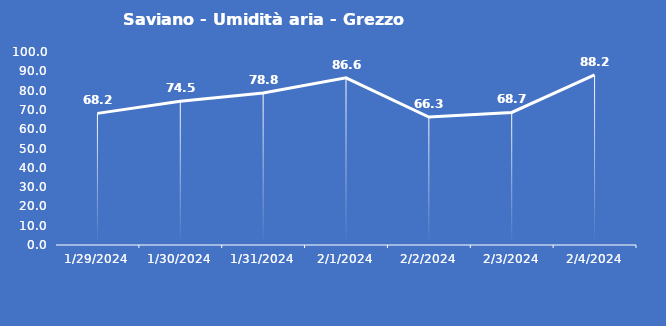
| Category | Saviano - Umidità aria - Grezzo (%) |
|---|---|
| 1/29/24 | 68.2 |
| 1/30/24 | 74.5 |
| 1/31/24 | 78.8 |
| 2/1/24 | 86.6 |
| 2/2/24 | 66.3 |
| 2/3/24 | 68.7 |
| 2/4/24 | 88.2 |